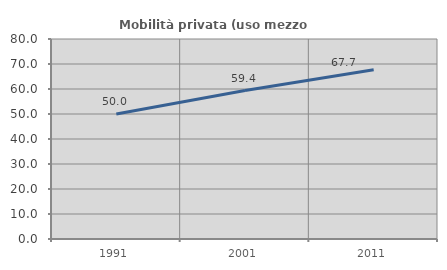
| Category | Mobilità privata (uso mezzo privato) |
|---|---|
| 1991.0 | 49.96 |
| 2001.0 | 59.395 |
| 2011.0 | 67.661 |